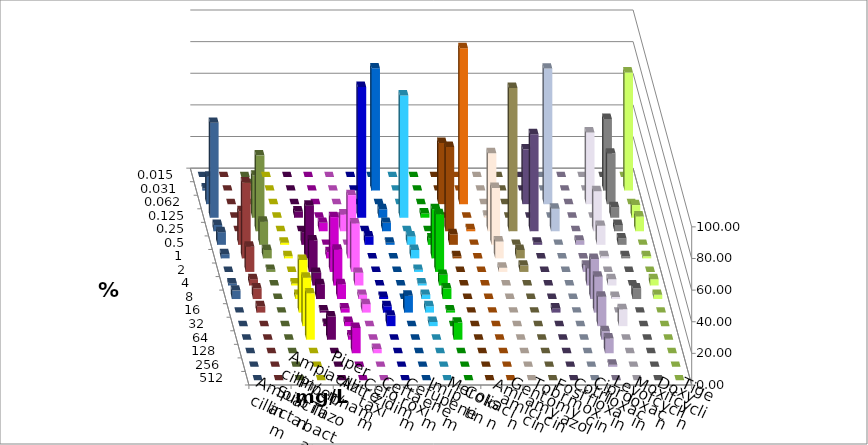
| Category | Ampicillin | Ampicillin/ Sulbactam | Piperacillin | Piperacillin/ Tazobactam | Aztreonam | Cefotaxim | Ceftazidim | Cefuroxim | Imipenem | Meropenem | Colistin | Amikacin | Gentamicin | Tobramycin | Fosfomycin | Cotrimoxazol | Ciprofloxacin | Levofloxacin | Moxifloxacin | Doxycyclin | Tigecyclin |
|---|---|---|---|---|---|---|---|---|---|---|---|---|---|---|---|---|---|---|---|---|---|
| 0.015 | 0 | 0 | 0 | 0 | 0 | 0 | 0 | 0 | 0 | 0 | 0 | 0 | 0 | 0 | 0 | 0 | 0 | 0 | 0 | 0 | 0 |
| 0.031 | 0 | 0 | 0 | 0 | 0 | 77.333 | 0 | 0 | 0 | 0 | 0 | 0 | 0 | 0 | 0 | 0 | 45.333 | 74.667 | 1.333 | 0 | 4 |
| 0.062 | 0 | 0 | 0 | 0 | 0 | 0 | 0 | 0 | 38.667 | 98.667 | 0 | 0 | 34.667 | 85.714 | 0 | 45.333 | 32 | 0 | 17.333 | 0 | 0 |
| 0.125 | 0 | 4 | 0 | 0 | 82.667 | 5.333 | 77.333 | 2.703 | 0 | 0 | 1.333 | 0 | 0 | 0 | 0 | 0 | 6.667 | 8 | 60 | 0 | 26.667 |
| 0.25 | 0 | 0 | 5.333 | 10.667 | 0 | 5.333 | 0 | 0 | 53.333 | 1.333 | 49.333 | 90.667 | 61.333 | 14.286 | 0 | 25.333 | 4 | 9.333 | 4 | 0 | 48 |
| 0.5 | 1.333 | 8 | 0 | 0 | 5.333 | 1.333 | 5.333 | 4.054 | 6.667 | 0 | 36 | 0 | 1.333 | 0 | 2.667 | 12 | 4 | 0 | 8 | 21.333 | 14.667 |
| 1.0 | 1.333 | 33.333 | 4 | 40 | 0 | 0 | 5.333 | 31.081 | 1.333 | 0 | 10.667 | 5.333 | 0 | 0 | 0 | 1.333 | 1.333 | 1.333 | 2.667 | 48 | 5.333 |
| 2.0 | 0 | 20 | 34.667 | 30.667 | 0 | 0 | 1.333 | 36.486 | 0 | 0 | 2.667 | 4 | 0 | 0 | 4 | 0 | 0 | 0 | 0 | 16 | 1.333 |
| 4.0 | 1.333 | 8 | 22.667 | 8 | 0 | 0 | 1.333 | 6.757 | 0 | 0 | 0 | 0 | 0 | 0 | 10.667 | 4 | 0 | 4 | 1.333 | 4 | 0 |
| 8.0 | 2.667 | 9.333 | 9.333 | 2.667 | 1.333 | 0 | 2.667 | 6.757 | 0 | 0 | 0 | 0 | 0 | 0 | 25.333 | 1.333 | 6.667 | 2.667 | 5.333 | 6.667 | 0 |
| 16.0 | 33.333 | 1.333 | 2.667 | 5.333 | 4 | 10.667 | 4 | 1.351 | 0 | 0 | 0 | 0 | 2.667 | 0 | 22.667 | 0 | 0 | 0 | 0 | 4 | 0 |
| 32.0 | 30.667 | 1.333 | 2.667 | 0 | 6.667 | 0 | 2.667 | 0 | 0 | 0 | 0 | 0 | 0 | 0 | 18.667 | 10.667 | 0 | 0 | 0 | 0 | 0 |
| 64.0 | 29.333 | 14.667 | 2.667 | 0 | 0 | 0 | 0 | 10.811 | 0 | 0 | 0 | 0 | 0 | 0 | 5.333 | 0 | 0 | 0 | 0 | 0 | 0 |
| 128.0 | 0 | 0 | 16 | 2.667 | 0 | 0 | 0 | 0 | 0 | 0 | 0 | 0 | 0 | 0 | 9.333 | 0 | 0 | 0 | 0 | 0 | 0 |
| 256.0 | 0 | 0 | 0 | 0 | 0 | 0 | 0 | 0 | 0 | 0 | 0 | 0 | 0 | 0 | 1.333 | 0 | 0 | 0 | 0 | 0 | 0 |
| 512.0 | 0 | 0 | 0 | 0 | 0 | 0 | 0 | 0 | 0 | 0 | 0 | 0 | 0 | 0 | 0 | 0 | 0 | 0 | 0 | 0 | 0 |